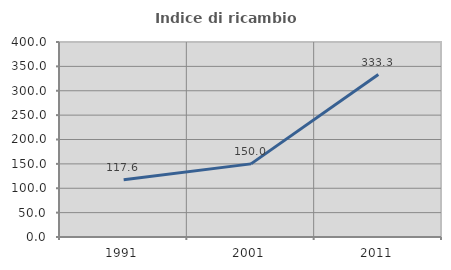
| Category | Indice di ricambio occupazionale  |
|---|---|
| 1991.0 | 117.647 |
| 2001.0 | 150 |
| 2011.0 | 333.333 |